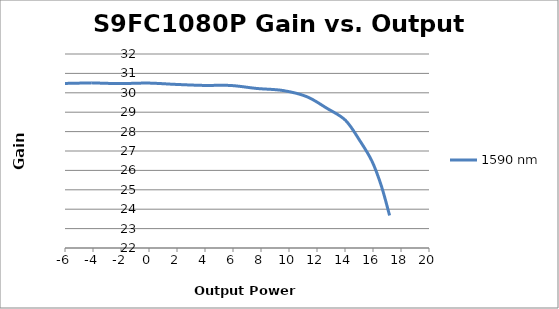
| Category | 1590 nm |
|---|---|
| -6.044 | 30.482 |
| -4.085 | 30.512 |
| -2.104 | 30.475 |
| -0.051 | 30.501 |
| 1.857 | 30.435 |
| 3.869 | 30.381 |
| 5.847 | 30.377 |
| 7.704 | 30.223 |
| 9.555 | 30.119 |
| 11.262 | 29.803 |
| 12.693 | 29.208 |
| 14.029 | 28.586 |
| 15.042 | 27.552 |
| 15.927 | 26.474 |
| 16.613 | 25.163 |
| 17.184 | 23.677 |